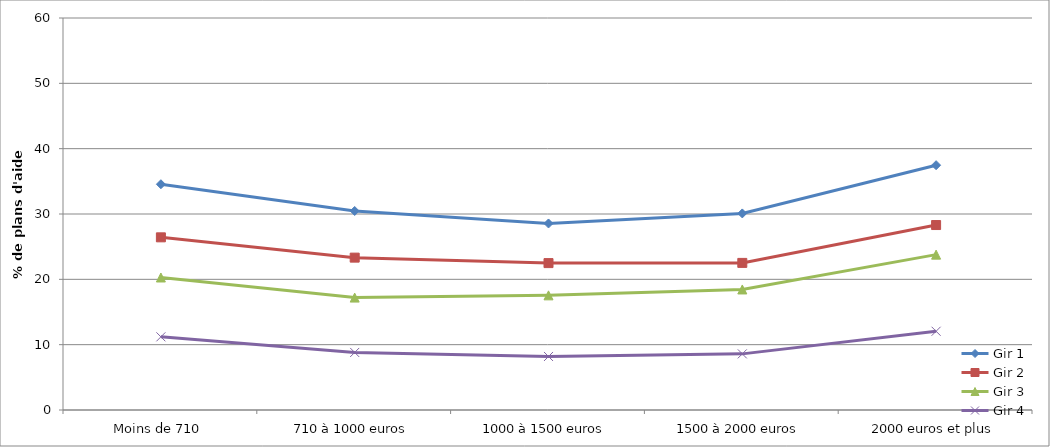
| Category | Gir 1 | Gir 2 | Gir 3 | Gir 4 |
|---|---|---|---|---|
| Moins de 710 | 34.557 | 26.428 | 20.281 | 11.198 |
| 710 à 1000 euros | 30.462 | 23.322 | 17.206 | 8.81 |
| 1000 à 1500 euros | 28.549 | 22.485 | 17.548 | 8.192 |
| 1500 à 2000 euros | 30.086 | 22.516 | 18.449 | 8.592 |
| 2000 euros et plus | 37.473 | 28.31 | 23.78 | 12.052 |